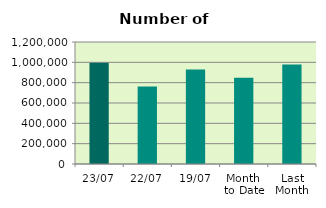
| Category | Series 0 |
|---|---|
| 23/07 | 995150 |
| 22/07 | 762726 |
| 19/07 | 929868 |
| Month 
to Date | 848057.412 |
| Last
Month | 977938.2 |